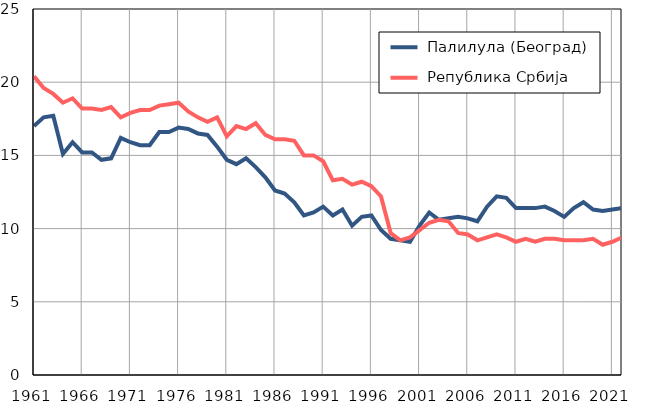
| Category |  Палилула (Београд) |  Република Србија |
|---|---|---|
| 1961.0 | 17 | 20.4 |
| 1962.0 | 17.6 | 19.6 |
| 1963.0 | 17.7 | 19.2 |
| 1964.0 | 15.1 | 18.6 |
| 1965.0 | 15.9 | 18.9 |
| 1966.0 | 15.2 | 18.2 |
| 1967.0 | 15.2 | 18.2 |
| 1968.0 | 14.7 | 18.1 |
| 1969.0 | 14.8 | 18.3 |
| 1970.0 | 16.2 | 17.6 |
| 1971.0 | 15.9 | 17.9 |
| 1972.0 | 15.7 | 18.1 |
| 1973.0 | 15.7 | 18.1 |
| 1974.0 | 16.6 | 18.4 |
| 1975.0 | 16.6 | 18.5 |
| 1976.0 | 16.9 | 18.6 |
| 1977.0 | 16.8 | 18 |
| 1978.0 | 16.5 | 17.6 |
| 1979.0 | 16.4 | 17.3 |
| 1980.0 | 15.6 | 17.6 |
| 1981.0 | 14.7 | 16.3 |
| 1982.0 | 14.4 | 17 |
| 1983.0 | 14.8 | 16.8 |
| 1984.0 | 14.2 | 17.2 |
| 1985.0 | 13.5 | 16.4 |
| 1986.0 | 12.6 | 16.1 |
| 1987.0 | 12.4 | 16.1 |
| 1988.0 | 11.8 | 16 |
| 1989.0 | 10.9 | 15 |
| 1990.0 | 11.1 | 15 |
| 1991.0 | 11.5 | 14.6 |
| 1992.0 | 10.9 | 13.3 |
| 1993.0 | 11.3 | 13.4 |
| 1994.0 | 10.2 | 13 |
| 1995.0 | 10.8 | 13.2 |
| 1996.0 | 10.9 | 12.9 |
| 1997.0 | 9.9 | 12.2 |
| 1998.0 | 9.3 | 9.7 |
| 1999.0 | 9.2 | 9.2 |
| 2000.0 | 9.1 | 9.4 |
| 2001.0 | 10.2 | 9.9 |
| 2002.0 | 11.1 | 10.4 |
| 2003.0 | 10.6 | 10.6 |
| 2004.0 | 10.7 | 10.5 |
| 2005.0 | 10.8 | 9.7 |
| 2006.0 | 10.7 | 9.6 |
| 2007.0 | 10.5 | 9.2 |
| 2008.0 | 11.5 | 9.4 |
| 2009.0 | 12.2 | 9.6 |
| 2010.0 | 12.1 | 9.4 |
| 2011.0 | 11.4 | 9.1 |
| 2012.0 | 11.4 | 9.3 |
| 2013.0 | 11.4 | 9.1 |
| 2014.0 | 11.5 | 9.3 |
| 2015.0 | 11.2 | 9.3 |
| 2016.0 | 10.8 | 9.2 |
| 2017.0 | 11.4 | 9.2 |
| 2018.0 | 11.8 | 9.2 |
| 2019.0 | 11.3 | 9.3 |
| 2020.0 | 11.2 | 8.9 |
| 2021.0 | 11.3 | 9.1 |
| 2022.0 | 11.4 | 9.4 |